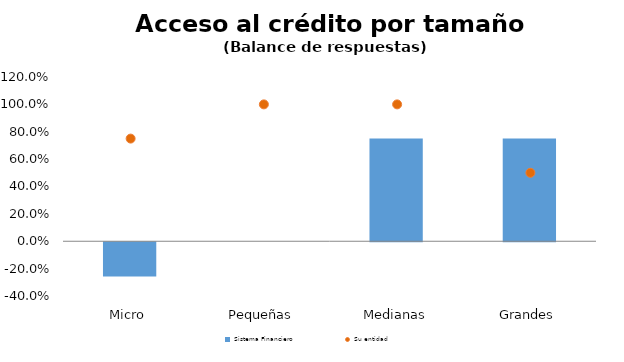
| Category | Sistema Financiero |
|---|---|
| Micro | -0.25 |
| Pequeñas | 0 |
| Medianas | 0.75 |
| Grandes | 0.75 |